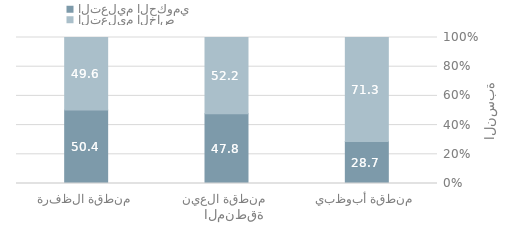
| Category | التعليم الحكومي | التعليم الخاص |
|---|---|---|
| منطقة أبوظبي | 28.72 | 71.28 |
| منطقة العين | 47.804 | 52.196 |
| منطقة الظفرة | 50.412 | 49.588 |